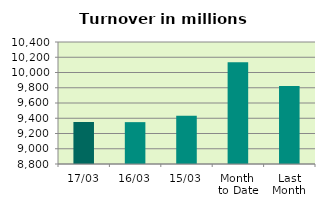
| Category | Series 0 |
|---|---|
| 17/03 | 9352.002 |
| 16/03 | 9348.977 |
| 15/03 | 9432.899 |
| Month 
to Date | 10135.995 |
| Last
Month | 9824.278 |